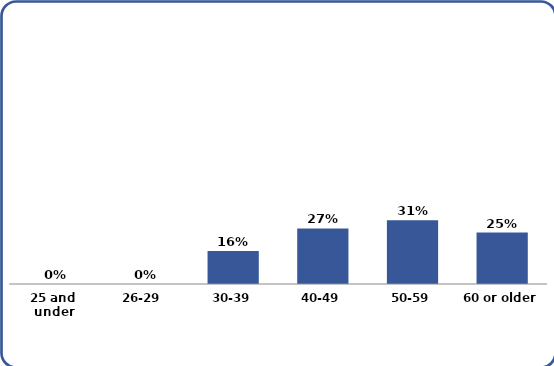
| Category | Series 0 |
|---|---|
| 25 and under | 0 |
| 26-29 | 0 |
| 30-39 | 0.16 |
| 40-49 | 0.27 |
| 50-59 | 0.31 |
| 60 or older | 0.25 |